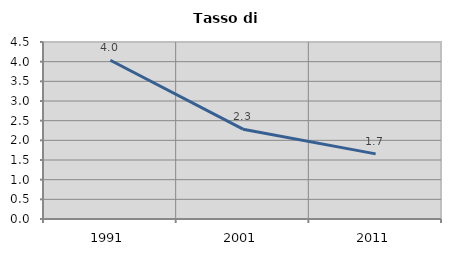
| Category | Tasso di disoccupazione   |
|---|---|
| 1991.0 | 4.036 |
| 2001.0 | 2.284 |
| 2011.0 | 1.655 |